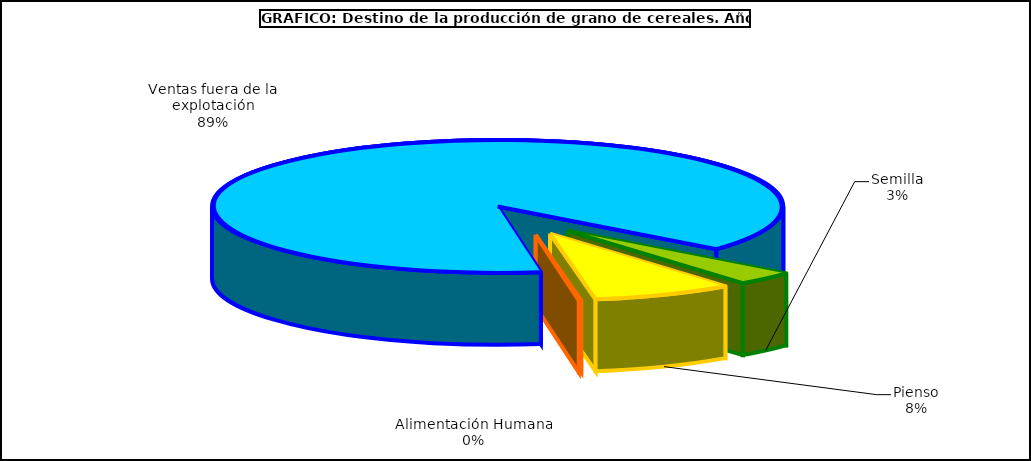
| Category | Series 0 |
|---|---|
| 0 | 561360 |
| 1 | 1327588 |
| 2 | 22163 |
| 3 | 14747730 |